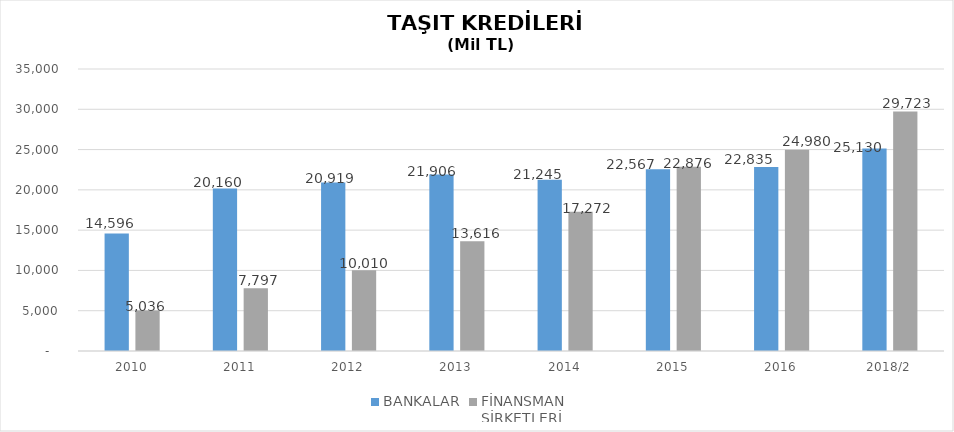
| Category | BANKALAR | FİNANSMAN 
ŞİRKETLERİ |
|---|---|---|
| 2010 | 14596 | 5035.89 |
| 2011 | 20160 | 7796.854 |
| 2012 | 20919 | 10009.755 |
| 2013 | 21906 | 13616.036 |
| 2014 | 21245 | 17271.844 |
| 2015 | 22567 | 22875.563 |
| 2016 | 22835 | 24980.231 |
| 2018/2 | 25130 | 29723.154 |